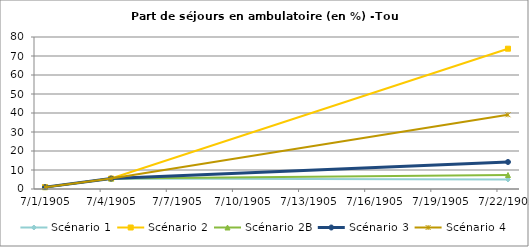
| Category | Scénario 1 | Scénario 2 | Scénario 2B | Scénario 3 | Scénario 4 |
|---|---|---|---|---|---|
| 2009.0 | 0.981 | 0.981 | 0.981 | 0.981 | 0.981 |
| 2012.0 | 5.499 | 5.499 | 5.499 | 5.499 | 5.499 |
| 2030.0 | 5.001 | 73.845 | 7.366 | 14.218 | 39.063 |